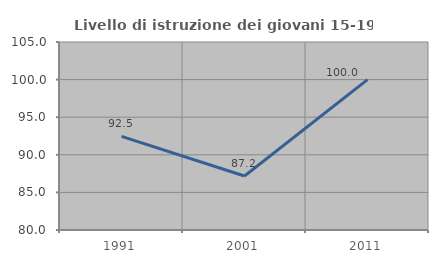
| Category | Livello di istruzione dei giovani 15-19 anni |
|---|---|
| 1991.0 | 92.453 |
| 2001.0 | 87.179 |
| 2011.0 | 100 |